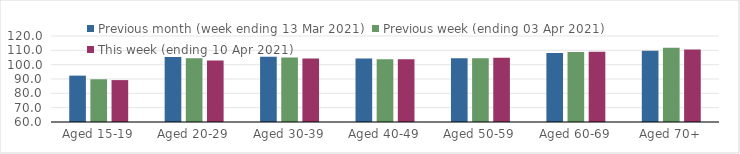
| Category | Previous month (week ending 13 Mar 2021) | Previous week (ending 03 Apr 2021) | This week (ending 10 Apr 2021) |
|---|---|---|---|
| Aged 15-19 | 92.35 | 89.82 | 89.23 |
| Aged 20-29 | 105.31 | 104.55 | 102.93 |
| Aged 30-39 | 105.51 | 104.96 | 104.31 |
| Aged 40-49 | 104.27 | 103.81 | 103.75 |
| Aged 50-59 | 104.41 | 104.51 | 104.75 |
| Aged 60-69 | 108.21 | 108.8 | 108.98 |
| Aged 70+ | 109.76 | 111.72 | 110.65 |